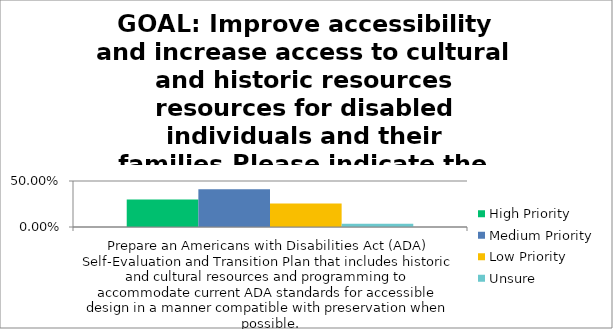
| Category | High Priority | Medium Priority | Low Priority | Unsure |
|---|---|---|---|---|
| Prepare an Americans with Disabilities Act (ADA) Self-Evaluation and Transition Plan that includes historic and cultural resources and programming to accommodate current ADA standards for accessible design in a manner compatible with preservation when poss | 0.298 | 0.411 | 0.255 | 0.036 |